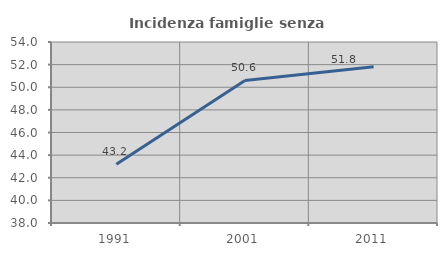
| Category | Incidenza famiglie senza nuclei |
|---|---|
| 1991.0 | 43.2 |
| 2001.0 | 50.605 |
| 2011.0 | 51.804 |